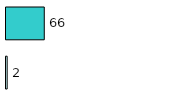
| Category | Series 0 | Series 1 |
|---|---|---|
| 0 | 2 | 66 |